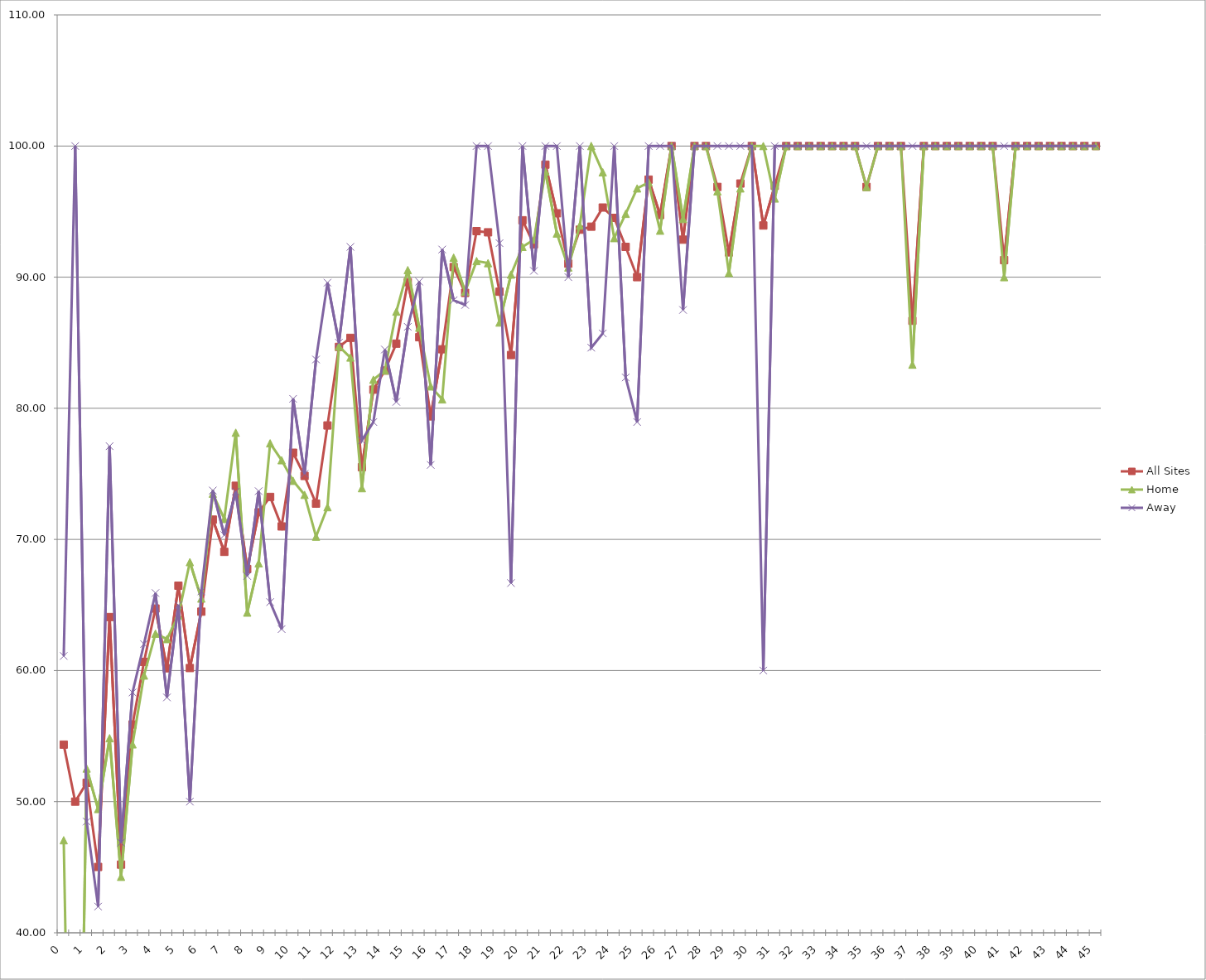
| Category | All Sites | Home | Away |
|---|---|---|---|
| 0.0 | 54.35 | 47.06 | 61.11 |
| 0.5 | 50 | 0 | 100 |
| 1.0 | 51.44 | 52.53 | 48.48 |
| 1.5 | 45.02 | 49.44 | 42 |
| 2.0 | 64.08 | 54.84 | 77.11 |
| 2.5 | 45.2 | 44.27 | 46.88 |
| 3.0 | 55.88 | 54.37 | 58.33 |
| 3.5 | 60.66 | 59.62 | 62.02 |
| 4.0 | 64.73 | 62.81 | 65.91 |
| 4.5 | 60.17 | 62.4 | 57.95 |
| 5.0 | 66.47 | 64.21 | 65 |
| 5.5 | 60.19 | 68.27 | 50 |
| 6.0 | 64.49 | 65.49 | 66.04 |
| 6.5 | 71.51 | 73.49 | 73.73 |
| 7.0 | 69.05 | 71.56 | 70.33 |
| 7.5 | 74.09 | 78.14 | 73.64 |
| 8.0 | 67.74 | 64.42 | 67.21 |
| 8.5 | 72.07 | 68.18 | 73.68 |
| 9.0 | 73.24 | 77.33 | 65.22 |
| 9.5 | 70.99 | 76.04 | 63.16 |
| 10.0 | 76.61 | 74.47 | 80.72 |
| 10.5 | 74.84 | 73.4 | 75 |
| 11.0 | 72.73 | 70.21 | 83.72 |
| 11.5 | 78.69 | 72.46 | 89.58 |
| 12.0 | 84.68 | 84.72 | 85 |
| 12.5 | 85.37 | 83.87 | 92.31 |
| 13.0 | 75.51 | 73.91 | 77.55 |
| 13.5 | 81.42 | 82.18 | 78.95 |
| 14.0 | 82.88 | 82.88 | 84.48 |
| 14.5 | 84.93 | 87.37 | 80.49 |
| 15.0 | 89.62 | 90.54 | 86.21 |
| 15.5 | 85.42 | 86.15 | 89.66 |
| 16.0 | 79.38 | 81.67 | 75.68 |
| 16.5 | 84.5 | 80.68 | 92.11 |
| 17.0 | 90.77 | 91.49 | 88.24 |
| 17.5 | 88.8 | 88.89 | 87.88 |
| 18.0 | 93.51 | 91.23 | 100 |
| 18.5 | 93.42 | 91.07 | 100 |
| 19.0 | 88.89 | 86.54 | 92.59 |
| 19.5 | 84.06 | 90.2 | 66.67 |
| 20.0 | 94.34 | 92.31 | 100 |
| 20.5 | 92.5 | 92.86 | 90.48 |
| 21.0 | 98.58 | 98.06 | 100 |
| 21.5 | 94.87 | 93.33 | 100 |
| 22.0 | 91.03 | 90.74 | 90 |
| 22.5 | 93.62 | 93.94 | 100 |
| 23.0 | 93.85 | 100 | 84.62 |
| 23.5 | 95.31 | 98 | 85.71 |
| 24.0 | 94.52 | 92.98 | 100 |
| 24.5 | 92.31 | 94.83 | 82.35 |
| 25.0 | 90 | 96.77 | 78.95 |
| 25.5 | 97.44 | 97.22 | 100 |
| 26.0 | 94.74 | 93.55 | 100 |
| 26.5 | 100 | 100 | 100 |
| 27.0 | 92.86 | 94.44 | 87.5 |
| 27.5 | 100 | 100 | 100 |
| 28.0 | 100 | 100 | 100 |
| 28.5 | 96.88 | 96.55 | 100 |
| 29.0 | 91.89 | 90.32 | 100 |
| 29.5 | 97.14 | 96.77 | 100 |
| 30.0 | 100 | 100 | 100 |
| 30.5 | 93.94 | 100 | 60 |
| 31.0 | 96.97 | 96 | 100 |
| 31.5 | 100 | 100 | 100 |
| 32.0 | 100 | 100 | 100 |
| 32.5 | 100 | 100 | 100 |
| 33.0 | 100 | 100 | 100 |
| 33.5 | 100 | 100 | 100 |
| 34.0 | 100 | 100 | 100 |
| 34.5 | 100 | 100 | 100 |
| 35.0 | 96.88 | 96.88 | 100 |
| 35.5 | 100 | 100 | 100 |
| 36.0 | 100 | 100 | 100 |
| 36.5 | 100 | 100 | 100 |
| 37.0 | 86.67 | 83.33 | 100 |
| 37.5 | 100 | 100 | 100 |
| 38.0 | 100 | 100 | 100 |
| 38.5 | 100 | 100 | 100 |
| 39.0 | 100 | 100 | 100 |
| 39.5 | 100 | 100 | 100 |
| 40.0 | 100 | 100 | 100 |
| 40.5 | 100 | 100 | 100 |
| 41.0 | 91.3 | 90 | 100 |
| 41.5 | 100 | 100 | 100 |
| 42.0 | 100 | 100 | 100 |
| 42.5 | 100 | 100 | 100 |
| 43.0 | 100 | 100 | 100 |
| 43.5 | 100 | 100 | 100 |
| 44.0 | 100 | 100 | 100 |
| 44.5 | 100 | 100 | 100 |
| 45.0 | 100 | 100 | 100 |